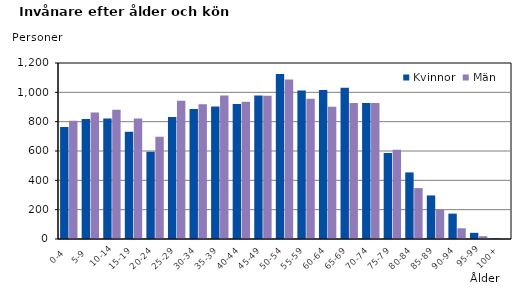
| Category | Kvinnor | Män |
|---|---|---|
|   0-4  | 763 | 806 |
|   5-9  | 819 | 862 |
| 10-14 | 821 | 882 |
| 15-19  | 732 | 821 |
| 20-24  | 595 | 698 |
| 25-29  | 832 | 942 |
| 30-34  | 886 | 918 |
| 35-39  | 903 | 978 |
| 40-44  | 920 | 936 |
| 45-49  | 979 | 977 |
| 50-54  | 1125 | 1087 |
| 55-59  | 1013 | 957 |
| 60-64  | 1016 | 901 |
| 65-69  | 1032 | 928 |
| 70-74  | 927 | 928 |
| 75-79  | 586 | 608 |
| 80-84  | 454 | 347 |
| 85-89  | 297 | 201 |
| 90-94  | 173 | 73 |
| 95-99 | 42 | 19 |
| 100+ | 4 | 1 |